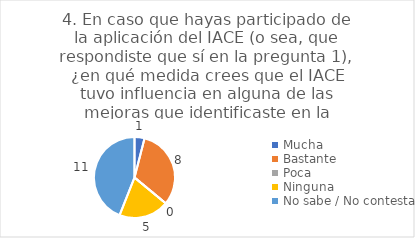
| Category | 4. En caso que hayas participado de la aplicación del IACE (o sea, que respondiste que sí en la pregunta 1), ¿en qué medida crees que el IACE tuvo influencia en alguna de las mejoras que identificaste en la pregunta anterior? |
|---|---|
| Mucha  | 0.04 |
| Bastante  | 0.32 |
| Poca  | 0 |
| Ninguna  | 0.2 |
| No sabe / No contesta | 0.44 |